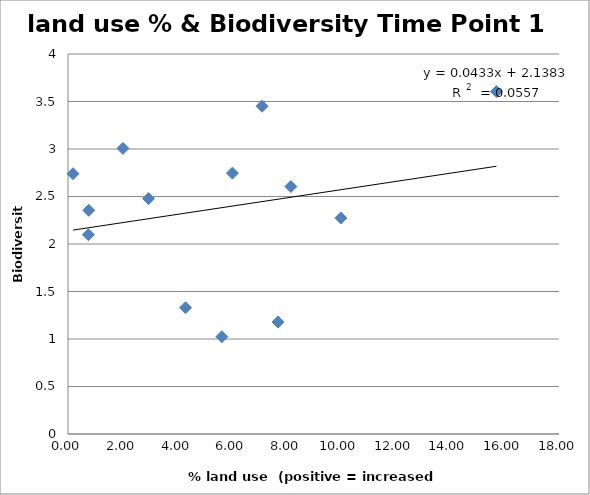
| Category | land use % |
|---|---|
| 2.951961863 | 2.478 |
| 6.026315789 | 2.746 |
| 0.7621736062 | 2.355 |
| 4.308650066 | 1.329 |
| 7.699722858 | 1.179 |
| 2.014550928 | 3.006 |
| 0.7469851305 | 2.097 |
| 5.641275137 | 1.024 |
| 8.169493931 | 2.605 |
| 15.70730132 | 3.604 |
| 7.113299087 | 3.45 |
| 0.1830108856 | 2.74 |
| 10.00235239 | 2.274 |